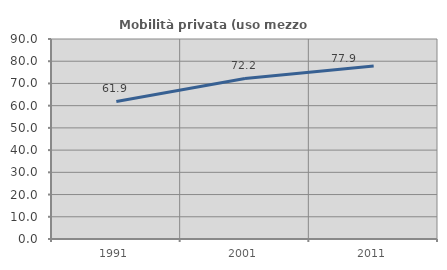
| Category | Mobilità privata (uso mezzo privato) |
|---|---|
| 1991.0 | 61.905 |
| 2001.0 | 72.234 |
| 2011.0 | 77.892 |